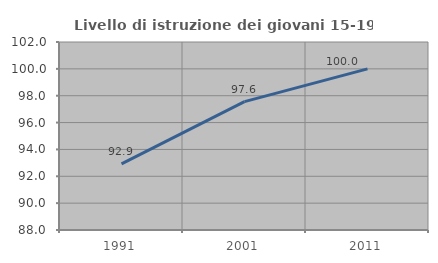
| Category | Livello di istruzione dei giovani 15-19 anni |
|---|---|
| 1991.0 | 92.929 |
| 2001.0 | 97.561 |
| 2011.0 | 100 |